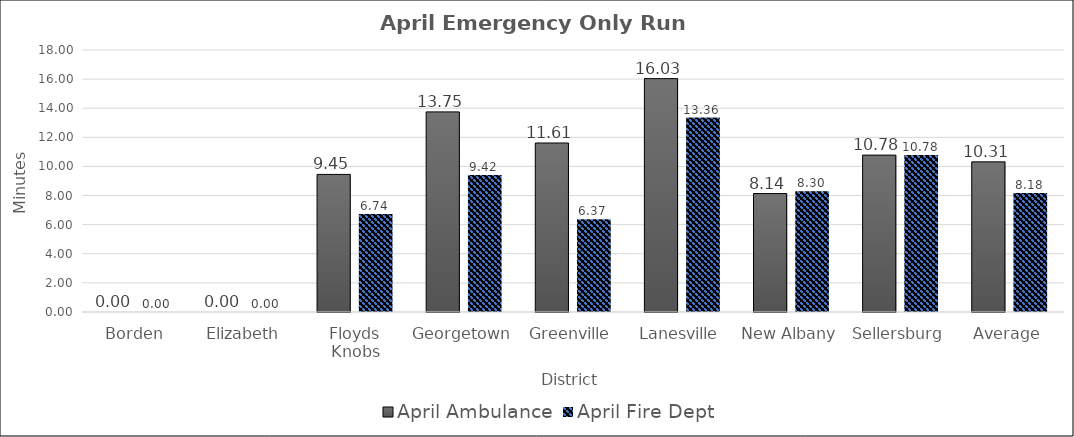
| Category | April |
|---|---|
| Borden | 0 |
| Elizabeth | 0 |
| Floyds Knobs | 6.739 |
| Georgetown | 9.417 |
| Greenville | 6.366 |
| Lanesville | 13.361 |
| New Albany | 8.302 |
| Sellersburg | 10.778 |
| Average | 8.182 |